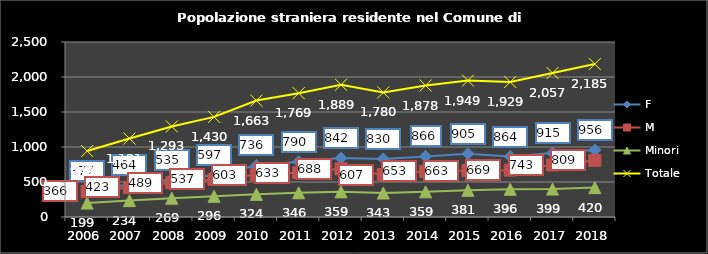
| Category | F | M | Minori | Totale |
|---|---|---|---|---|
| 2006.0 | 377 | 366 | 199 | 942 |
| 2007.0 | 464 | 423 | 234 | 1121 |
| 2008.0 | 535 | 489 | 269 | 1293 |
| 2009.0 | 597 | 537 | 296 | 1430 |
| 2010.0 | 736 | 603 | 324 | 1663 |
| 2011.0 | 790 | 633 | 346 | 1769 |
| 2012.0 | 842 | 688 | 359 | 1889 |
| 2013.0 | 830 | 607 | 343 | 1780 |
| 2014.0 | 866 | 653 | 359 | 1878 |
| 2015.0 | 905 | 663 | 381 | 1949 |
| 2016.0 | 864 | 669 | 396 | 1929 |
| 2017.0 | 915 | 743 | 399 | 2057 |
| 2018.0 | 956 | 809 | 420 | 2185 |